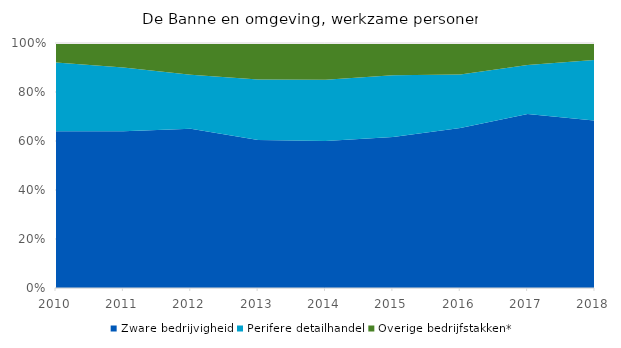
| Category | Zware bedrijvigheid | Perifere detailhandel | Overige bedrijfstakken* |
|---|---|---|---|
| 2010 | 0.64 | 0.28 | 0.08 |
| 2011 | 0.64 | 0.26 | 0.1 |
| 2012 | 0.65 | 0.22 | 0.13 |
| 2013 | 0.61 | 0.25 | 0.15 |
| 2014 | 0.6 | 0.25 | 0.15 |
| 2015 | 0.61 | 0.25 | 0.13 |
| 2016 | 0.66 | 0.22 | 0.13 |
| 2017 | 0.71 | 0.2 | 0.09 |
| 2018 | 0.69 | 0.25 | 0.07 |